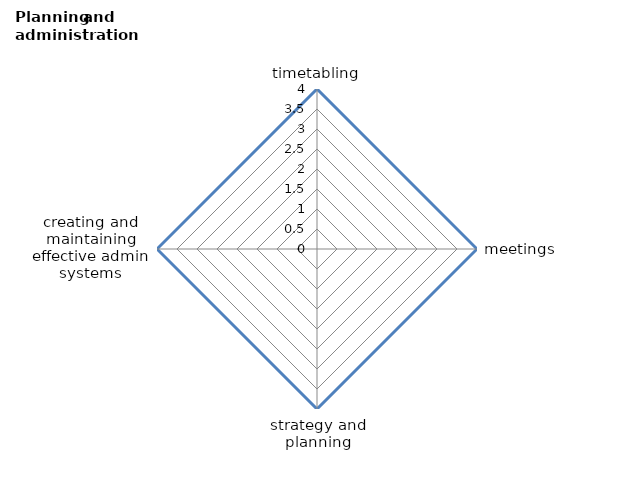
| Category | Series 0 | Series 1 |
|---|---|---|
| timetabling | 4 | 0 |
| meetings | 4 | 0 |
| strategy and planning | 4 | 0 |
| creating and maintaining effective admin systems | 4 | 0 |